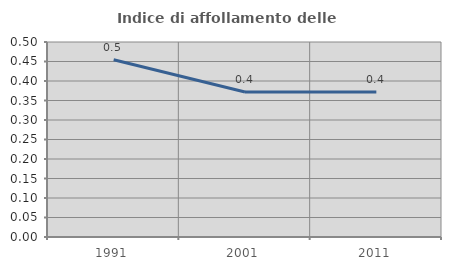
| Category | Indice di affollamento delle abitazioni  |
|---|---|
| 1991.0 | 0.455 |
| 2001.0 | 0.372 |
| 2011.0 | 0.372 |